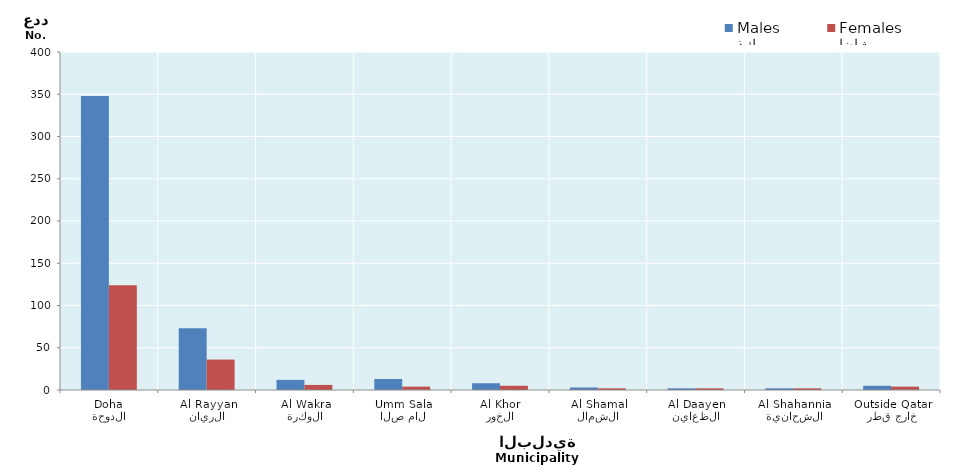
| Category | ذكور
Males | إناث
Females |
|---|---|---|
| الدوحة
Doha | 348 | 124 |
| الريان
Al Rayyan | 73 | 36 |
| الوكرة
Al Wakra | 12 | 6 |
| ام صلال
Umm Salal | 13 | 4 |
| الخور
Al Khor | 8 | 5 |
| الشمال
Al Shamal | 3 | 2 |
| الظعاين
Al Daayen | 2 | 2 |
| الشحانية
Al Shahannia | 2 | 2 |
| خارج قطر
Outside Qatar | 5 | 4 |